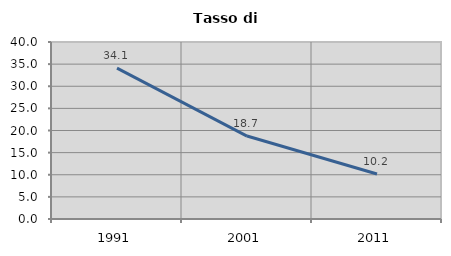
| Category | Tasso di disoccupazione   |
|---|---|
| 1991.0 | 34.093 |
| 2001.0 | 18.743 |
| 2011.0 | 10.178 |